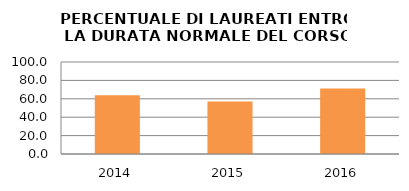
| Category | 2014 2015 2016 |
|---|---|
| 2014.0 | 63.889 |
| 2015.0 | 56.989 |
| 2016.0 | 71.111 |